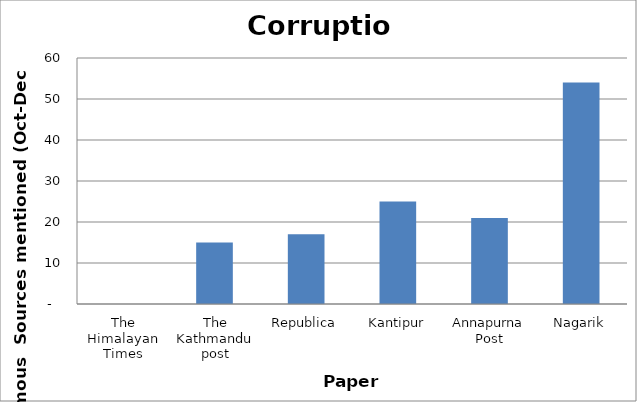
| Category | Corruption |
|---|---|
| The Himalayan Times | 0 |
| The Kathmandu post | 15 |
| Republica | 17 |
| Kantipur | 25 |
| Annapurna Post | 21 |
| Nagarik | 54 |